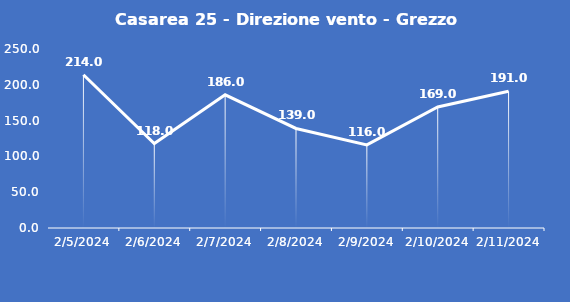
| Category | Casarea 25 - Direzione vento - Grezzo (°N) |
|---|---|
| 2/5/24 | 214 |
| 2/6/24 | 118 |
| 2/7/24 | 186 |
| 2/8/24 | 139 |
| 2/9/24 | 116 |
| 2/10/24 | 169 |
| 2/11/24 | 191 |